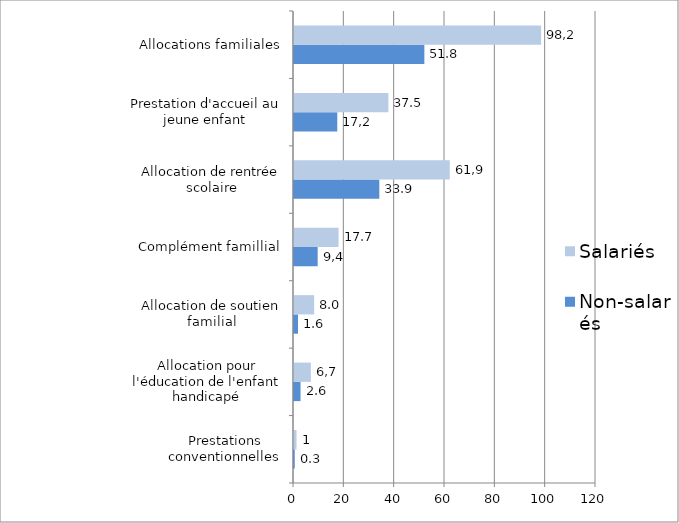
| Category | Non-salariés | Salariés |
|---|---|---|
| Prestations conventionnelles | 0.3 | 1 |
| Allocation pour l'éducation de l'enfant handicapé | 2.6 | 6.7 |
| Allocation de soutien familial | 1.6 | 8 |
| Complément famillial | 9.4 | 17.7 |
| Allocation de rentrée scolaire | 33.9 | 61.9 |
| Prestation d'accueil au jeune enfant | 17.2 | 37.5 |
| Allocations familiales | 51.8 | 98.2 |